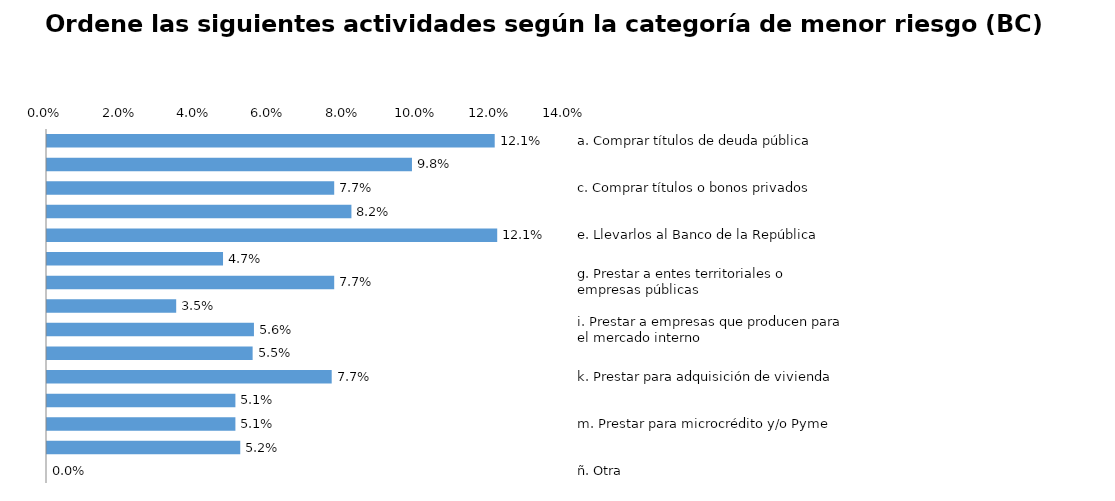
| Category | Series 0 |
|---|---|
| a. Comprar títulos de deuda pública | 0.121 |
| b. Comprar títulos o bonos hipotecarios | 0.098 |
| c. Comprar títulos o bonos privados | 0.077 |
| d. Prestar a entidades financieras | 0.082 |
| e. Llevarlos al Banco de la República | 0.121 |
| f.  Prestar a empresas con inversión extranjera | 0.047 |
| g. Prestar a entes territoriales o empresas públicas | 0.077 |
| h. Prestar para consumo | 0.035 |
| i. Prestar a empresas que producen para el mercado interno | 0.056 |
| j. Prestar a constructores | 0.055 |
| k. Prestar para adquisición de vivienda | 0.077 |
| l. Prestar a empresas que producen en una alta proporción para el mercado externo | 0.051 |
| m. Prestar para microcrédito y/o Pyme | 0.051 |
| n. Aumentar la posición propia en moneda extranjera | 0.052 |
| ñ. Otra | 0 |